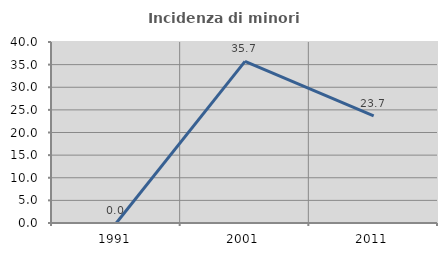
| Category | Incidenza di minori stranieri |
|---|---|
| 1991.0 | 0 |
| 2001.0 | 35.714 |
| 2011.0 | 23.684 |